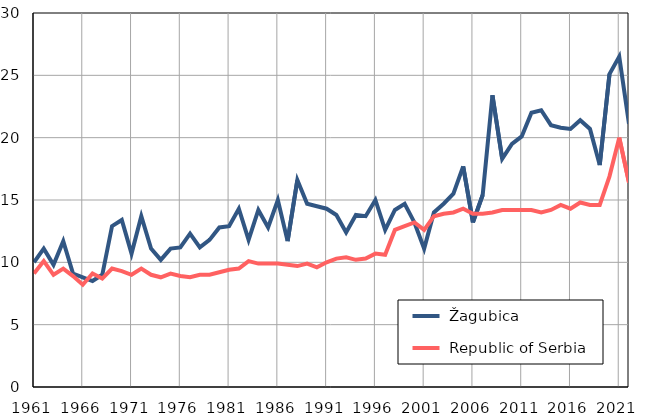
| Category |  Žagubica |  Republic of Serbia |
|---|---|---|
| 1961.0 | 10 | 9.1 |
| 1962.0 | 11.1 | 10.1 |
| 1963.0 | 9.8 | 9 |
| 1964.0 | 11.7 | 9.5 |
| 1965.0 | 9.1 | 8.9 |
| 1966.0 | 8.8 | 8.2 |
| 1967.0 | 8.5 | 9.1 |
| 1968.0 | 9 | 8.7 |
| 1969.0 | 12.9 | 9.5 |
| 1970.0 | 13.4 | 9.3 |
| 1971.0 | 10.7 | 9 |
| 1972.0 | 13.7 | 9.5 |
| 1973.0 | 11.1 | 9 |
| 1974.0 | 10.2 | 8.8 |
| 1975.0 | 11.1 | 9.1 |
| 1976.0 | 11.2 | 8.9 |
| 1977.0 | 12.3 | 8.8 |
| 1978.0 | 11.2 | 9 |
| 1979.0 | 11.8 | 9 |
| 1980.0 | 12.8 | 9.2 |
| 1981.0 | 12.9 | 9.4 |
| 1982.0 | 14.3 | 9.5 |
| 1983.0 | 11.8 | 10.1 |
| 1984.0 | 14.2 | 9.9 |
| 1985.0 | 12.8 | 9.9 |
| 1986.0 | 15 | 9.9 |
| 1987.0 | 11.7 | 9.8 |
| 1988.0 | 16.6 | 9.7 |
| 1989.0 | 14.7 | 9.9 |
| 1990.0 | 14.5 | 9.6 |
| 1991.0 | 14.3 | 10 |
| 1992.0 | 13.8 | 10.3 |
| 1993.0 | 12.4 | 10.4 |
| 1994.0 | 13.8 | 10.2 |
| 1995.0 | 13.7 | 10.3 |
| 1996.0 | 15 | 10.7 |
| 1997.0 | 12.6 | 10.6 |
| 1998.0 | 14.2 | 12.6 |
| 1999.0 | 14.7 | 12.9 |
| 2000.0 | 13.2 | 13.2 |
| 2001.0 | 11.1 | 12.6 |
| 2002.0 | 14 | 13.7 |
| 2003.0 | 14.7 | 13.9 |
| 2004.0 | 15.5 | 14 |
| 2005.0 | 17.7 | 14.3 |
| 2006.0 | 13.2 | 13.9 |
| 2007.0 | 15.4 | 13.9 |
| 2008.0 | 23.4 | 14 |
| 2009.0 | 18.3 | 14.2 |
| 2010.0 | 19.5 | 14.2 |
| 2011.0 | 20.1 | 14.2 |
| 2012.0 | 22 | 14.2 |
| 2013.0 | 22.2 | 14 |
| 2014.0 | 21 | 14.2 |
| 2015.0 | 20.8 | 14.6 |
| 2016.0 | 20.7 | 14.3 |
| 2017.0 | 21.4 | 14.8 |
| 2018.0 | 20.7 | 14.6 |
| 2019.0 | 17.8 | 14.6 |
| 2020.0 | 25.1 | 16.9 |
| 2021.0 | 26.5 | 20 |
| 2022.0 | 21.1 | 16.4 |